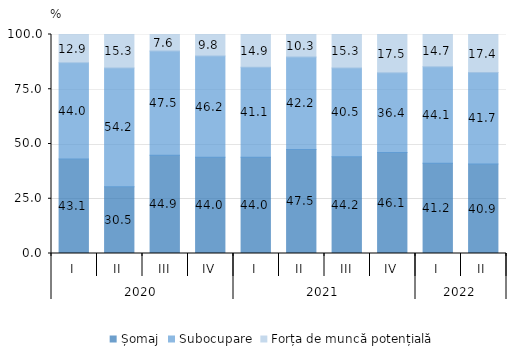
| Category | Șomaj | Subocupare | Forța de muncă potențială |
|---|---|---|---|
| 0 | 43.127 | 44.01 | 12.863 |
| 1 | 30.523 | 54.216 | 15.261 |
| 2 | 44.874 | 47.548 | 7.578 |
| 3 | 44 | 46.2 | 9.8 |
| 4 | 44 | 41.1 | 14.9 |
| 5 | 47.504 | 42.209 | 10.287 |
| 6 | 44.2 | 40.5 | 15.3 |
| 7 | 46.1 | 36.4 | 17.5 |
| 8 | 41.2 | 44.1 | 14.7 |
| 9 | 40.9 | 41.7 | 17.4 |